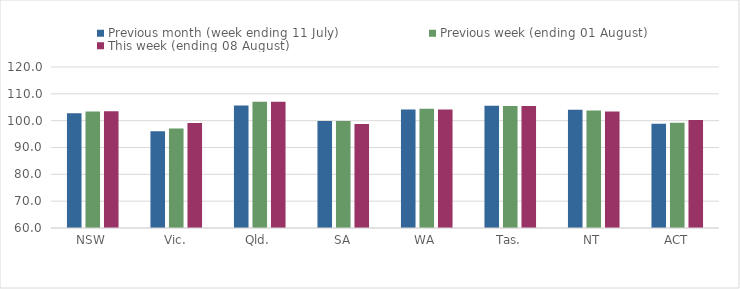
| Category | Previous month (week ending 11 July) | Previous week (ending 01 August) | This week (ending 08 August) |
|---|---|---|---|
| NSW | 102.74 | 103.439 | 103.528 |
| Vic. | 96.032 | 97.077 | 99.129 |
| Qld. | 105.617 | 107.096 | 107.096 |
| SA | 99.842 | 99.912 | 98.778 |
| WA | 104.196 | 104.466 | 104.162 |
| Tas. | 105.553 | 105.446 | 105.47 |
| NT | 104.104 | 103.825 | 103.413 |
| ACT | 98.844 | 99.263 | 100.267 |